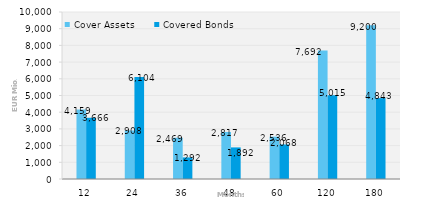
| Category | Cover Assets | Covered Bonds |
|---|---|---|
| 12.0 | 4159.157 | 3666.099 |
| 24.0 | 2907.967 | 6103.747 |
| 36.0 | 2469.173 | 1291.722 |
| 48.0 | 2816.906 | 1892.147 |
| 60.0 | 2535.593 | 2067.53 |
| 120.0 | 7691.988 | 5015.161 |
| 180.0 | 9199.86 | 4842.635 |